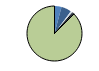
| Category | Series 0 |
|---|---|
| ARRASTRE | 9 |
| CERCO | 13 |
| ATUNEROS CAÑEROS | 0 |
| PALANGRE DE FONDO | 2 |
| PALANGRE DE SUPERFICIE | 1 |
| RASCO | 0 |
| VOLANTA | 2 |
| ARTES FIJAS | 0 |
| ARTES MENORES | 191 |